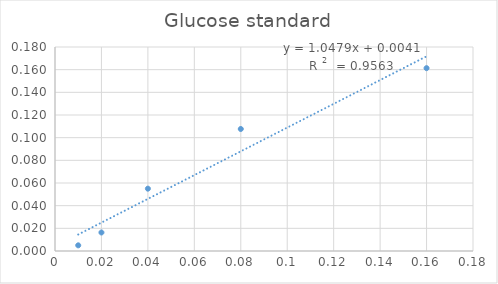
| Category | Series 0 |
|---|---|
| 0.01 | 0.005 |
| 0.02 | 0.016 |
| 0.04 | 0.055 |
| 0.08 | 0.108 |
| 0.16 | 0.161 |